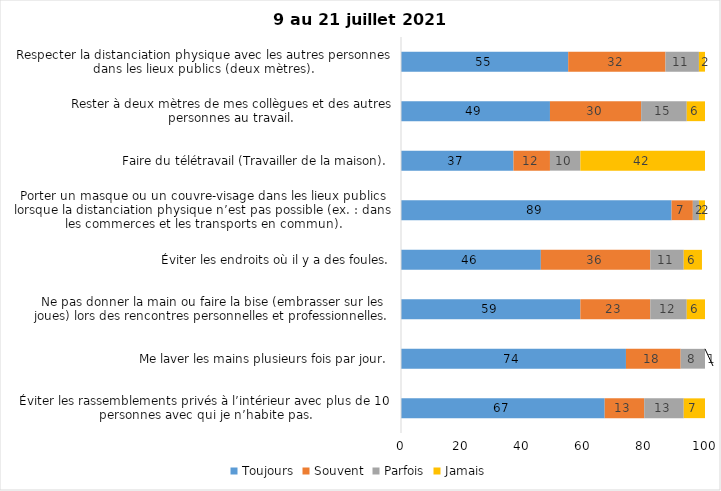
| Category | Toujours | Souvent | Parfois | Jamais |
|---|---|---|---|---|
| Éviter les rassemblements privés à l’intérieur avec plus de 10 personnes avec qui je n’habite pas. | 67 | 13 | 13 | 7 |
| Me laver les mains plusieurs fois par jour. | 74 | 18 | 8 | 1 |
| Ne pas donner la main ou faire la bise (embrasser sur les joues) lors des rencontres personnelles et professionnelles. | 59 | 23 | 12 | 6 |
| Éviter les endroits où il y a des foules. | 46 | 36 | 11 | 6 |
| Porter un masque ou un couvre-visage dans les lieux publics lorsque la distanciation physique n’est pas possible (ex. : dans les commerces et les transports en commun). | 89 | 7 | 2 | 2 |
| Faire du télétravail (Travailler de la maison). | 37 | 12 | 10 | 42 |
| Rester à deux mètres de mes collègues et des autres personnes au travail. | 49 | 30 | 15 | 6 |
| Respecter la distanciation physique avec les autres personnes dans les lieux publics (deux mètres). | 55 | 32 | 11 | 2 |